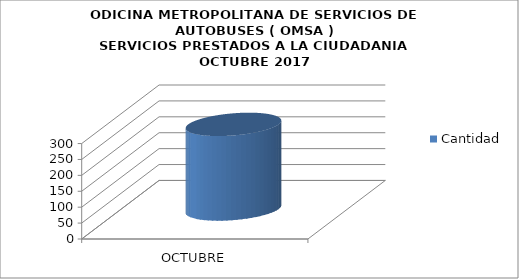
| Category | Cantidad |
|---|---|
| OCTUBRE | 266 |